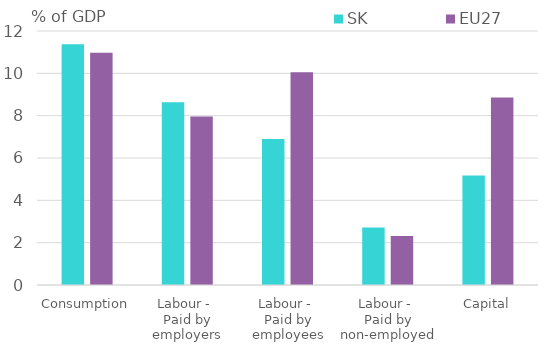
| Category | SK | EU27 |
|---|---|---|
| Consumption | 11.374 | 10.967 |
| Labour - 
Paid by employers | 8.632 | 7.966 |
| Labour - 
Paid by employees | 6.893 | 10.052 |
| Labour - 
Paid by non-employed | 2.717 | 2.311 |
| Capital | 5.174 | 8.858 |